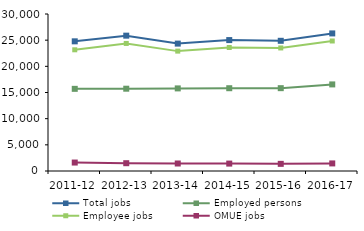
| Category | Total jobs | Employed persons | Employee jobs | OMUE jobs |
|---|---|---|---|---|
| 2011-12 | 24778 | 15699 | 23160 | 1615 |
| 2012-13 | 25862 | 15725 | 24373 | 1490 |
| 2013-14 | 24343 | 15784 | 22908 | 1434 |
| 2014-15 | 25017 | 15819 | 23600 | 1415 |
| 2015-16 | 24879 | 15828 | 23512 | 1365 |
| 2016-17 | 26290 | 16545 | 24842 | 1448 |